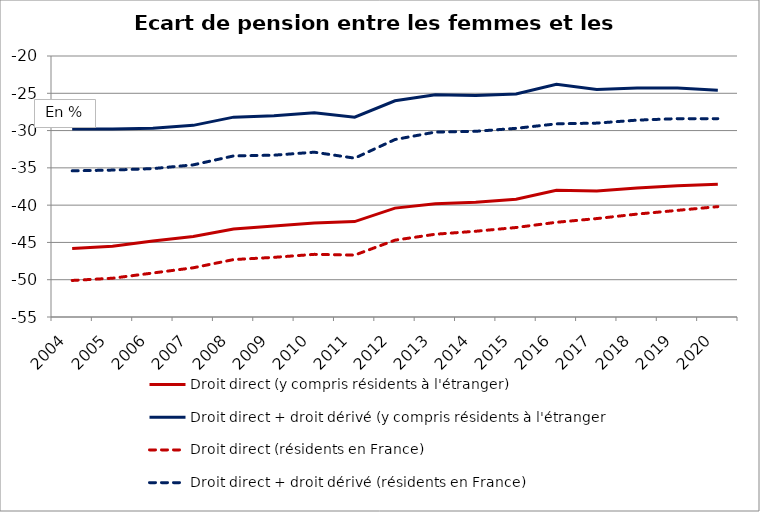
| Category | Droit direct (y compris résidents à l'étranger) | Droit direct + droit dérivé (y compris résidents à l'étranger | Droit direct (résidents en France) | Droit direct + droit dérivé (résidents en France) |
|---|---|---|---|---|
| 2004.0 | -45.8 | -29.8 | -50.1 | -35.4 |
| 2005.0 | -45.5 | -29.8 | -49.8 | -35.3 |
| 2006.0 | -44.8 | -29.7 | -49.1 | -35.1 |
| 2007.0 | -44.2 | -29.3 | -48.4 | -34.6 |
| 2008.0 | -43.2 | -28.2 | -47.3 | -33.4 |
| 2009.0 | -42.8 | -28 | -47 | -33.3 |
| 2010.0 | -42.4 | -27.6 | -46.6 | -32.9 |
| 2011.0 | -42.2 | -28.2 | -46.7 | -33.7 |
| 2012.0 | -40.4 | -26 | -44.7 | -31.2 |
| 2013.0 | -39.8 | -25.2 | -43.9 | -30.2 |
| 2014.0 | -39.6 | -25.3 | -43.5 | -30.1 |
| 2015.0 | -39.2 | -25.1 | -43 | -29.7 |
| 2016.0 | -38 | -23.8 | -42.3 | -29.1 |
| 2017.0 | -38.1 | -24.5 | -41.8 | -29 |
| 2018.0 | -37.7 | -24.3 | -41.2 | -28.6 |
| 2019.0 | -37.4 | -24.3 | -40.7 | -28.4 |
| 2020.0 | -37.2 | -24.6 | -40.2 | -28.4 |